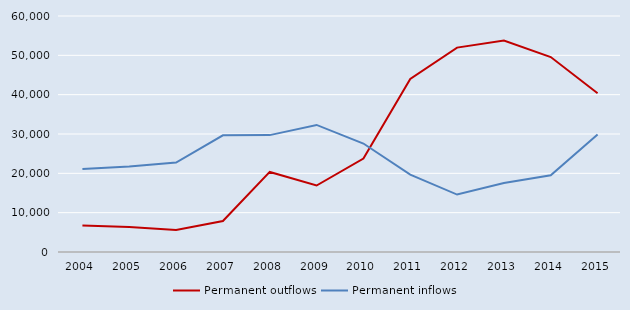
| Category | Permanent outflows | Permanent inflows |
|---|---|---|
| 2004.0 | 6757 | 21093 |
| 2005.0 | 6360 | 21741 |
| 2006.0 | 5600 | 22741 |
| 2007.0 | 7890 | 29661 |
| 2008.0 | 20357 | 29718 |
| 2009.0 | 16899 | 32307 |
| 2010.0 | 23760 | 27575 |
| 2011.0 | 43998 | 19667 |
| 2012.0 | 51958 | 14606 |
| 2013.0 | 53786 | 17554 |
| 2014.0 | 49572 | 19516 |
| 2015.0 | 40377 | 29896 |